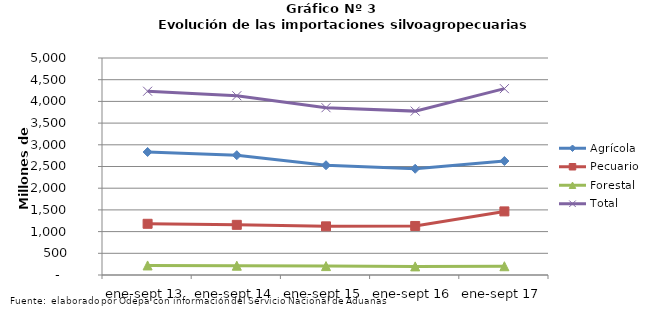
| Category | Agrícola | Pecuario | Forestal | Total |
|---|---|---|---|---|
| ene-sept 13 | 2834241 | 1180041 | 220233 | 4234515 |
| ene-sept 14 | 2760868 | 1155683 | 213974 | 4130525 |
| ene-sept 15 | 2528907 | 1120917 | 204996 | 3854820 |
| ene-sept 16 | 2447939 | 1129936 | 198194 | 3776069 |
| ene-sept 17 | 2626541 | 1465360 | 201910 | 4293811 |